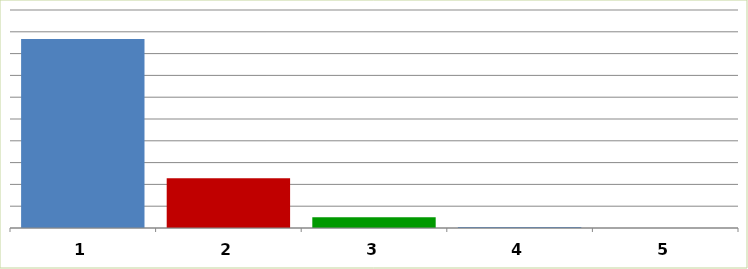
| Category | Series 0 |
|---|---|
| 0 | 86702324 |
| 1 | 22815048 |
| 2 | 4930000 |
| 3 | 450000 |
| 4 | 0 |